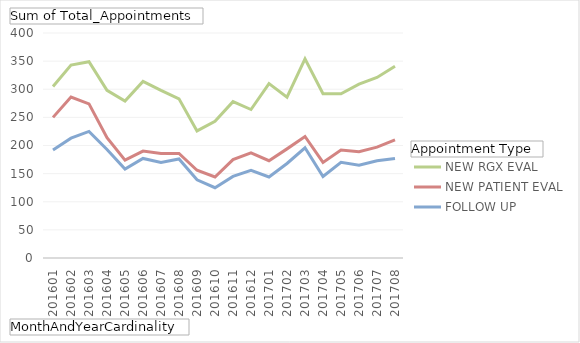
| Category | FOLLOW UP | NEW PATIENT EVAL | NEW RGX EVAL |
|---|---|---|---|
| 201601 | 192 | 58 | 55 |
| 201602 | 213 | 73 | 57 |
| 201603 | 225 | 49 | 75 |
| 201604 | 193 | 21 | 84 |
| 201605 | 158 | 16 | 105 |
| 201606 | 177 | 13 | 124 |
| 201607 | 170 | 16 | 112 |
| 201608 | 176 | 10 | 97 |
| 201609 | 139 | 17 | 70 |
| 201610 | 125 | 19 | 99 |
| 201611 | 145 | 30 | 103 |
| 201612 | 156 | 31 | 77 |
| 201701 | 144 | 29 | 137 |
| 201702 | 168 | 26 | 92 |
| 201703 | 196 | 20 | 138 |
| 201704 | 145 | 25 | 122 |
| 201705 | 170 | 22 | 100 |
| 201706 | 165 | 24 | 120 |
| 201707 | 173 | 24 | 124 |
| 201708 | 177 | 33 | 131 |